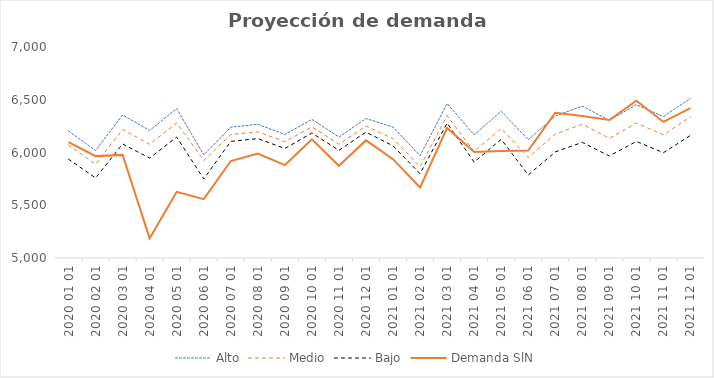
| Category | Alto | Medio | Bajo | Demanda SlN |
|---|---|---|---|---|
| 2020-01-01 | 6205.267 | 6070.871 | 5937.376 | 6099.052 |
| 2020-02-01 | 6018.639 | 5888.124 | 5758.482 | 5965.707 |
| 2020-03-01 | 6355.971 | 6218.061 | 6081.075 | 5977.202 |
| 2020-04-01 | 6208.985 | 6077.52 | 5946.954 | 5186.619 |
| 2020-05-01 | 6416.365 | 6280.72 | 6146.001 | 5627.536 |
| 2020-06-01 | 5976.926 | 5924.062 | 5749.467 | 5558.349 |
| 2020-07-01 | 6240.201 | 6169.759 | 6105.38 | 5919.144 |
| 2020-08-01 | 6267.147 | 6196.453 | 6131.844 | 5989.965 |
| 2020-09-01 | 6171.071 | 6101.465 | 6037.851 | 5880.814 |
| 2020-10-01 | 6314.047 | 6243.486 | 6184.873 | 6124.705 |
| 2020-11-01 | 6147 | 6078 | 6021 | 5873.754 |
| 2020-12-01 | 6322 | 6251 | 6193 | 6114.64 |
| 2021-01-01 | 6241 | 6131 | 6063 | 5936.88 |
| 2021-02-01 | 5970 | 5865 | 5799 | 5667.98 |
| 2021-03-01 | 6464 | 6349 | 6279 | 6233.3 |
| 2021-04-01 | 6167 | 6009 | 5909 | 6004.43 |
| 2021-05-01 | 6391 | 6228 | 6125 | 6015.21 |
| 2021-06-01 | 6121.497 | 5953.572 | 5786.898 | 6017.83 |
| 2021-07-01 | 6344.632 | 6174.327 | 6005.341 | 6377.15 |
| 2021-08-01 | 6440.327 | 6267.447 | 6095.906 | 6346.91 |
| 2021-09-01 | 6304.224 | 6134.922 | 5966.931 | 6307.74 |
| 2021-10-01 | 6453.375 | 6278.594 | 6105.12 | 6490.08 |
| 2021-11-01 | 6340.191 | 6168.519 | 5998.13 | 6289.74 |
| 2021-12-01 | 6513.409 | 6337.108 | 6162.125 | 6421.02 |